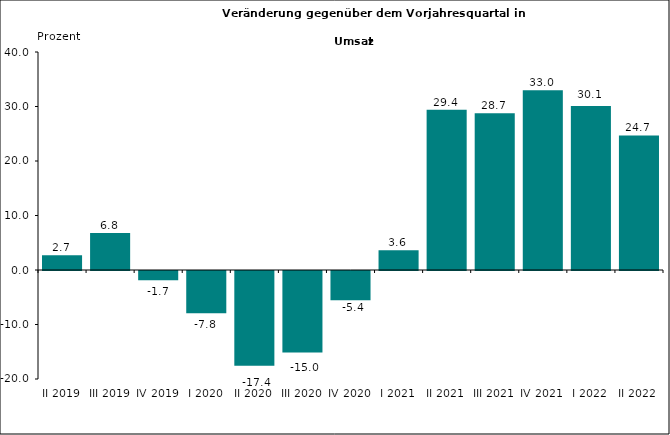
| Category | 2,7 |
|---|---|
| II 2019 | 2.702 |
| III 2019 | 6.777 |
| IV 2019 | -1.702 |
| I 2020 | -7.775 |
| II 2020 | -17.405 |
| III 2020 | -14.955 |
| IV 2020 | -5.368 |
| I 2021 | 3.627 |
| II 2021 | 29.396 |
| III 2021 | 28.748 |
| IV 2021 | 33 |
| I 2022 | 30.1 |
| II 2022 | 24.7 |